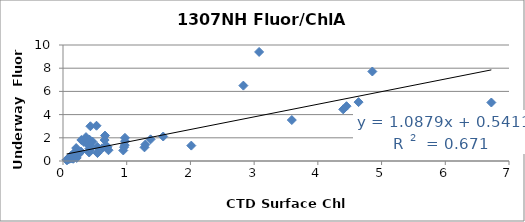
| Category | Series 0 |
|---|---|
| 1.293 | 1.423 |
| 0.141 | 0.316 |
| 0.179 | 0.338 |
| 0.129 | 0.246 |
| 0.139 | 0.261 |
| 0.173 | 0.268 |
| 0.159 | 0.192 |
| 0.251 | 0.755 |
| 0.361 | 2.059 |
| 0.463 | 1.668 |
| 0.215 | 0.263 |
| 0.179 | 0.708 |
| 0.127 | 0.346 |
| 0.102 | 0.193 |
| 0.061 | 0.09 |
| 0.056 | 0.106 |
| 0.064 | 0.099 |
| 0.135 | 0.364 |
| 0.415 | 1.073 |
| 0.43 | 2.994 |
| 0.288 | 1.812 |
| 0.653 | 1.807 |
| 3.078 | 9.401 |
| 0.659 | 2.192 |
| 0.969 | 1.369 |
| 0.195 | 0.484 |
| 0.207 | 1.116 |
| 0.101 | 0.206 |
| 0.066 | 0.107 |
| 0.081 | 0.169 |
| 0.413 | 1.85 |
| 0.43 | 0.904 |
| 0.537 | 1.217 |
| 0.972 | 1.997 |
| 0.974 | 1.709 |
| 1.279 | 1.177 |
| 0.541 | 0.684 |
| 2.014 | 1.327 |
| 0.946 | 0.908 |
| 4.639 | 5.075 |
| 4.45 | 4.725 |
| 4.398 | 4.452 |
| 0.404 | 1.352 |
| 0.526 | 3.04 |
| 0.329 | 1.635 |
| 0.11 | 0.303 |
| 0.095 | 0.257 |
| 0.129 | 0.462 |
| 0.173 | 0.685 |
| 0.714 | 0.928 |
| 4.855 | 7.716 |
| 1.375 | 1.866 |
| 6.723 | 5.043 |
| 3.591 | 3.531 |
| 1.573 | 2.112 |
| 2.831 | 6.498 |
| 0.421 | 1.346 |
| 0.236 | 0.683 |
| 0.221 | 0.491 |
| 0.959 | 1.196 |
| 0.411 | 0.734 |
| 0.614 | 1.099 |
| 0.667 | 1.243 |
| 0.699 | 1.223 |
| 0.282 | 0.811 |
| 0.141 | 0.366 |
| 0.145 | 0.345 |
| 0.18 | 0.348 |
| 0.247 | 0.601 |